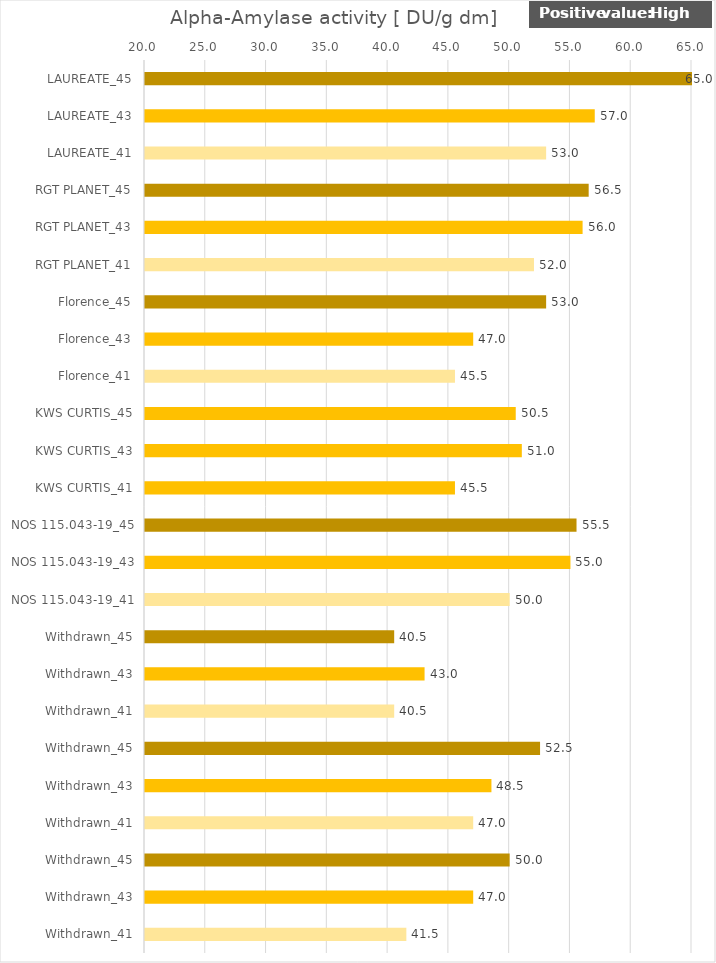
| Category |    Alpha-Amylase activity [ DU/g dm] |
|---|---|
| LAUREATE_45 | 65 |
| LAUREATE_43 | 57 |
| LAUREATE_41 | 53 |
| RGT PLANET_45 | 56.5 |
| RGT PLANET_43 | 56 |
| RGT PLANET_41 | 52 |
| Florence_45 | 53 |
| Florence_43 | 47 |
| Florence_41 | 45.5 |
| KWS CURTIS_45 | 50.5 |
| KWS CURTIS_43 | 51 |
| KWS CURTIS_41 | 45.5 |
| NOS 115.043-19_45 | 55.5 |
| NOS 115.043-19_43 | 55 |
| NOS 115.043-19_41 | 50 |
| Withdrawn_45 | 40.5 |
| Withdrawn_43 | 43 |
| Withdrawn_41 | 40.5 |
| Withdrawn_45 | 52.5 |
| Withdrawn_43 | 48.5 |
| Withdrawn_41 | 47 |
| Withdrawn_45 | 50 |
| Withdrawn_43 | 47 |
| Withdrawn_41 | 41.5 |